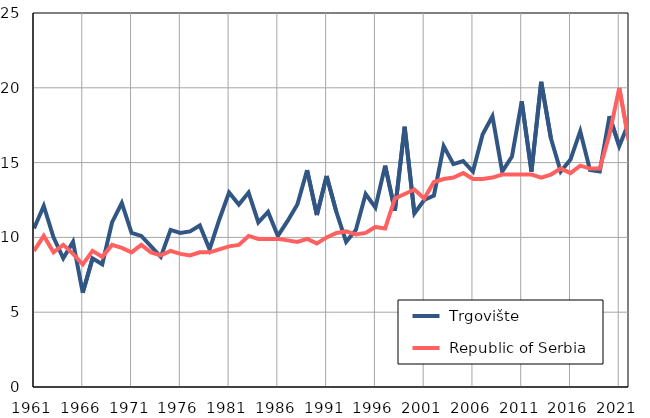
| Category |  Trgovište |  Republic of Serbia |
|---|---|---|
| 1961.0 | 10.6 | 9.1 |
| 1962.0 | 12.1 | 10.1 |
| 1963.0 | 10 | 9 |
| 1964.0 | 8.6 | 9.5 |
| 1965.0 | 9.7 | 8.9 |
| 1966.0 | 6.3 | 8.2 |
| 1967.0 | 8.6 | 9.1 |
| 1968.0 | 8.2 | 8.7 |
| 1969.0 | 11 | 9.5 |
| 1970.0 | 12.3 | 9.3 |
| 1971.0 | 10.3 | 9 |
| 1972.0 | 10.1 | 9.5 |
| 1973.0 | 9.4 | 9 |
| 1974.0 | 8.7 | 8.8 |
| 1975.0 | 10.5 | 9.1 |
| 1976.0 | 10.3 | 8.9 |
| 1977.0 | 10.4 | 8.8 |
| 1978.0 | 10.8 | 9 |
| 1979.0 | 9.2 | 9 |
| 1980.0 | 11.2 | 9.2 |
| 1981.0 | 13 | 9.4 |
| 1982.0 | 12.2 | 9.5 |
| 1983.0 | 13 | 10.1 |
| 1984.0 | 11 | 9.9 |
| 1985.0 | 11.7 | 9.9 |
| 1986.0 | 10.1 | 9.9 |
| 1987.0 | 11.1 | 9.8 |
| 1988.0 | 12.2 | 9.7 |
| 1989.0 | 14.5 | 9.9 |
| 1990.0 | 11.5 | 9.6 |
| 1991.0 | 14.1 | 10 |
| 1992.0 | 11.7 | 10.3 |
| 1993.0 | 9.7 | 10.4 |
| 1994.0 | 10.5 | 10.2 |
| 1995.0 | 12.9 | 10.3 |
| 1996.0 | 12 | 10.7 |
| 1997.0 | 14.8 | 10.6 |
| 1998.0 | 11.8 | 12.6 |
| 1999.0 | 17.4 | 12.9 |
| 2000.0 | 11.6 | 13.2 |
| 2001.0 | 12.5 | 12.6 |
| 2002.0 | 12.8 | 13.7 |
| 2003.0 | 16.1 | 13.9 |
| 2004.0 | 14.9 | 14 |
| 2005.0 | 15.1 | 14.3 |
| 2006.0 | 14.4 | 13.9 |
| 2007.0 | 16.9 | 13.9 |
| 2008.0 | 18.1 | 14 |
| 2009.0 | 14.4 | 14.2 |
| 2010.0 | 15.4 | 14.2 |
| 2011.0 | 19.1 | 14.2 |
| 2012.0 | 14.4 | 14.2 |
| 2013.0 | 20.4 | 14 |
| 2014.0 | 16.6 | 14.2 |
| 2015.0 | 14.4 | 14.6 |
| 2016.0 | 15.2 | 14.3 |
| 2017.0 | 17.1 | 14.8 |
| 2018.0 | 14.5 | 14.6 |
| 2019.0 | 14.4 | 14.6 |
| 2020.0 | 18.1 | 16.9 |
| 2021.0 | 16.1 | 20 |
| 2022.0 | 17.7 | 16.4 |